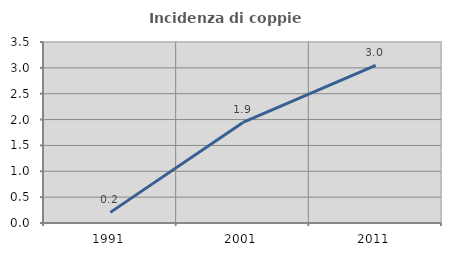
| Category | Incidenza di coppie miste |
|---|---|
| 1991.0 | 0.205 |
| 2001.0 | 1.946 |
| 2011.0 | 3.047 |